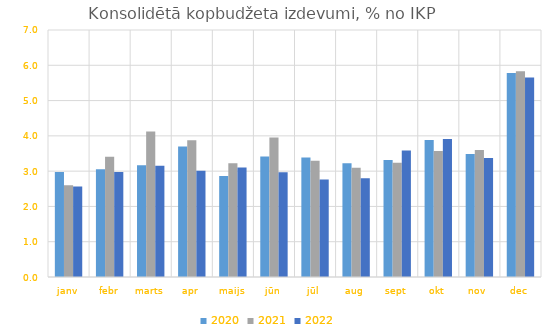
| Category | 2020 | 2021 | 2022 |
|---|---|---|---|
| janv | 2.976 | 2.603 | 2.565 |
| febr | 3.051 | 3.408 | 2.978 |
| marts | 3.169 | 4.125 | 3.149 |
| apr | 3.697 | 3.875 | 3.011 |
| maijs | 2.865 | 3.227 | 3.104 |
| jūn | 3.414 | 3.955 | 2.972 |
| jūl | 3.388 | 3.292 | 2.76 |
| aug | 3.226 | 3.096 | 2.801 |
| sept | 3.317 | 3.239 | 3.584 |
| okt | 3.883 | 3.572 | 3.914 |
| nov | 3.485 | 3.597 | 3.376 |
| dec | 5.782 | 5.828 | 5.657 |